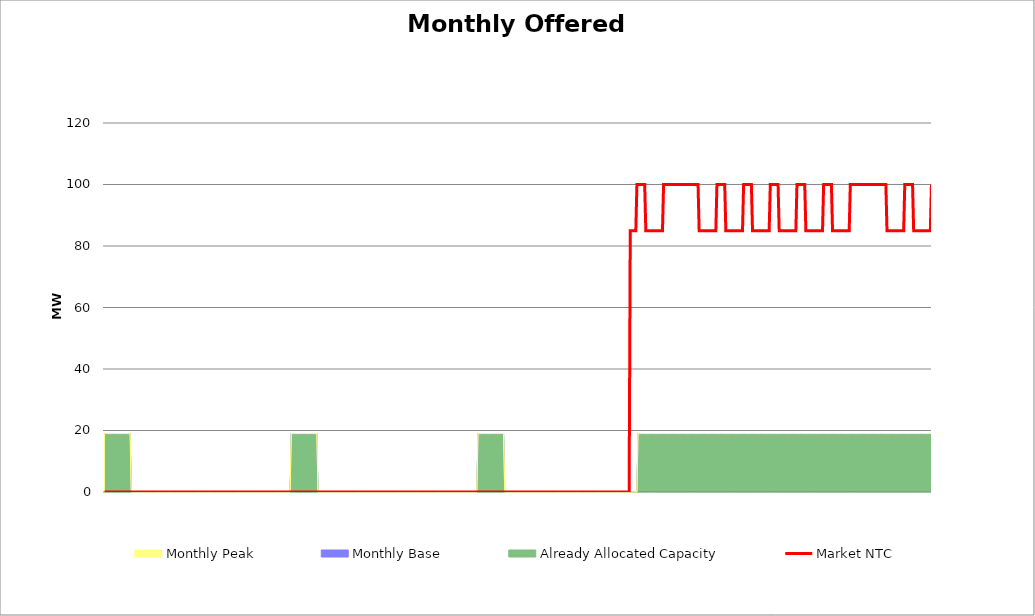
| Category | Market NTC |
|---|---|
| 0 | 0 |
| 1 | 0 |
| 2 | 0 |
| 3 | 0 |
| 4 | 0 |
| 5 | 0 |
| 6 | 0 |
| 7 | 0 |
| 8 | 0 |
| 9 | 0 |
| 10 | 0 |
| 11 | 0 |
| 12 | 0 |
| 13 | 0 |
| 14 | 0 |
| 15 | 0 |
| 16 | 0 |
| 17 | 0 |
| 18 | 0 |
| 19 | 0 |
| 20 | 0 |
| 21 | 0 |
| 22 | 0 |
| 23 | 0 |
| 24 | 0 |
| 25 | 0 |
| 26 | 0 |
| 27 | 0 |
| 28 | 0 |
| 29 | 0 |
| 30 | 0 |
| 31 | 0 |
| 32 | 0 |
| 33 | 0 |
| 34 | 0 |
| 35 | 0 |
| 36 | 0 |
| 37 | 0 |
| 38 | 0 |
| 39 | 0 |
| 40 | 0 |
| 41 | 0 |
| 42 | 0 |
| 43 | 0 |
| 44 | 0 |
| 45 | 0 |
| 46 | 0 |
| 47 | 0 |
| 48 | 0 |
| 49 | 0 |
| 50 | 0 |
| 51 | 0 |
| 52 | 0 |
| 53 | 0 |
| 54 | 0 |
| 55 | 0 |
| 56 | 0 |
| 57 | 0 |
| 58 | 0 |
| 59 | 0 |
| 60 | 0 |
| 61 | 0 |
| 62 | 0 |
| 63 | 0 |
| 64 | 0 |
| 65 | 0 |
| 66 | 0 |
| 67 | 0 |
| 68 | 0 |
| 69 | 0 |
| 70 | 0 |
| 71 | 0 |
| 72 | 0 |
| 73 | 0 |
| 74 | 0 |
| 75 | 0 |
| 76 | 0 |
| 77 | 0 |
| 78 | 0 |
| 79 | 0 |
| 80 | 0 |
| 81 | 0 |
| 82 | 0 |
| 83 | 0 |
| 84 | 0 |
| 85 | 0 |
| 86 | 0 |
| 87 | 0 |
| 88 | 0 |
| 89 | 0 |
| 90 | 0 |
| 91 | 0 |
| 92 | 0 |
| 93 | 0 |
| 94 | 0 |
| 95 | 0 |
| 96 | 0 |
| 97 | 0 |
| 98 | 0 |
| 99 | 0 |
| 100 | 0 |
| 101 | 0 |
| 102 | 0 |
| 103 | 0 |
| 104 | 0 |
| 105 | 0 |
| 106 | 0 |
| 107 | 0 |
| 108 | 0 |
| 109 | 0 |
| 110 | 0 |
| 111 | 0 |
| 112 | 0 |
| 113 | 0 |
| 114 | 0 |
| 115 | 0 |
| 116 | 0 |
| 117 | 0 |
| 118 | 0 |
| 119 | 0 |
| 120 | 0 |
| 121 | 0 |
| 122 | 0 |
| 123 | 0 |
| 124 | 0 |
| 125 | 0 |
| 126 | 0 |
| 127 | 0 |
| 128 | 0 |
| 129 | 0 |
| 130 | 0 |
| 131 | 0 |
| 132 | 0 |
| 133 | 0 |
| 134 | 0 |
| 135 | 0 |
| 136 | 0 |
| 137 | 0 |
| 138 | 0 |
| 139 | 0 |
| 140 | 0 |
| 141 | 0 |
| 142 | 0 |
| 143 | 0 |
| 144 | 0 |
| 145 | 0 |
| 146 | 0 |
| 147 | 0 |
| 148 | 0 |
| 149 | 0 |
| 150 | 0 |
| 151 | 0 |
| 152 | 0 |
| 153 | 0 |
| 154 | 0 |
| 155 | 0 |
| 156 | 0 |
| 157 | 0 |
| 158 | 0 |
| 159 | 0 |
| 160 | 0 |
| 161 | 0 |
| 162 | 0 |
| 163 | 0 |
| 164 | 0 |
| 165 | 0 |
| 166 | 0 |
| 167 | 0 |
| 168 | 0 |
| 169 | 0 |
| 170 | 0 |
| 171 | 0 |
| 172 | 0 |
| 173 | 0 |
| 174 | 0 |
| 175 | 0 |
| 176 | 0 |
| 177 | 0 |
| 178 | 0 |
| 179 | 0 |
| 180 | 0 |
| 181 | 0 |
| 182 | 0 |
| 183 | 0 |
| 184 | 0 |
| 185 | 0 |
| 186 | 0 |
| 187 | 0 |
| 188 | 0 |
| 189 | 0 |
| 190 | 0 |
| 191 | 0 |
| 192 | 0 |
| 193 | 0 |
| 194 | 0 |
| 195 | 0 |
| 196 | 0 |
| 197 | 0 |
| 198 | 0 |
| 199 | 0 |
| 200 | 0 |
| 201 | 0 |
| 202 | 0 |
| 203 | 0 |
| 204 | 0 |
| 205 | 0 |
| 206 | 0 |
| 207 | 0 |
| 208 | 0 |
| 209 | 0 |
| 210 | 0 |
| 211 | 0 |
| 212 | 0 |
| 213 | 0 |
| 214 | 0 |
| 215 | 0 |
| 216 | 0 |
| 217 | 0 |
| 218 | 0 |
| 219 | 0 |
| 220 | 0 |
| 221 | 0 |
| 222 | 0 |
| 223 | 0 |
| 224 | 0 |
| 225 | 0 |
| 226 | 0 |
| 227 | 0 |
| 228 | 0 |
| 229 | 0 |
| 230 | 0 |
| 231 | 0 |
| 232 | 0 |
| 233 | 0 |
| 234 | 0 |
| 235 | 0 |
| 236 | 0 |
| 237 | 0 |
| 238 | 0 |
| 239 | 0 |
| 240 | 0 |
| 241 | 0 |
| 242 | 0 |
| 243 | 0 |
| 244 | 0 |
| 245 | 0 |
| 246 | 0 |
| 247 | 0 |
| 248 | 0 |
| 249 | 0 |
| 250 | 0 |
| 251 | 0 |
| 252 | 0 |
| 253 | 0 |
| 254 | 0 |
| 255 | 0 |
| 256 | 0 |
| 257 | 0 |
| 258 | 0 |
| 259 | 0 |
| 260 | 0 |
| 261 | 0 |
| 262 | 0 |
| 263 | 0 |
| 264 | 0 |
| 265 | 0 |
| 266 | 0 |
| 267 | 0 |
| 268 | 0 |
| 269 | 0 |
| 270 | 0 |
| 271 | 0 |
| 272 | 0 |
| 273 | 0 |
| 274 | 0 |
| 275 | 0 |
| 276 | 0 |
| 277 | 0 |
| 278 | 0 |
| 279 | 0 |
| 280 | 0 |
| 281 | 0 |
| 282 | 0 |
| 283 | 0 |
| 284 | 0 |
| 285 | 0 |
| 286 | 0 |
| 287 | 0 |
| 288 | 0 |
| 289 | 0 |
| 290 | 0 |
| 291 | 0 |
| 292 | 0 |
| 293 | 0 |
| 294 | 0 |
| 295 | 0 |
| 296 | 0 |
| 297 | 0 |
| 298 | 0 |
| 299 | 0 |
| 300 | 0 |
| 301 | 0 |
| 302 | 0 |
| 303 | 0 |
| 304 | 0 |
| 305 | 0 |
| 306 | 0 |
| 307 | 0 |
| 308 | 0 |
| 309 | 0 |
| 310 | 0 |
| 311 | 0 |
| 312 | 0 |
| 313 | 0 |
| 314 | 0 |
| 315 | 0 |
| 316 | 0 |
| 317 | 0 |
| 318 | 0 |
| 319 | 0 |
| 320 | 0 |
| 321 | 0 |
| 322 | 0 |
| 323 | 0 |
| 324 | 0 |
| 325 | 0 |
| 326 | 0 |
| 327 | 0 |
| 328 | 0 |
| 329 | 0 |
| 330 | 0 |
| 331 | 0 |
| 332 | 0 |
| 333 | 0 |
| 334 | 0 |
| 335 | 0 |
| 336 | 0 |
| 337 | 0 |
| 338 | 0 |
| 339 | 0 |
| 340 | 0 |
| 341 | 0 |
| 342 | 0 |
| 343 | 0 |
| 344 | 0 |
| 345 | 0 |
| 346 | 0 |
| 347 | 0 |
| 348 | 0 |
| 349 | 0 |
| 350 | 0 |
| 351 | 0 |
| 352 | 0 |
| 353 | 0 |
| 354 | 0 |
| 355 | 0 |
| 356 | 0 |
| 357 | 0 |
| 358 | 0 |
| 359 | 0 |
| 360 | 0 |
| 361 | 0 |
| 362 | 0 |
| 363 | 0 |
| 364 | 0 |
| 365 | 0 |
| 366 | 0 |
| 367 | 0 |
| 368 | 0 |
| 369 | 0 |
| 370 | 0 |
| 371 | 0 |
| 372 | 0 |
| 373 | 0 |
| 374 | 0 |
| 375 | 0 |
| 376 | 0 |
| 377 | 0 |
| 378 | 0 |
| 379 | 0 |
| 380 | 0 |
| 381 | 0 |
| 382 | 0 |
| 383 | 0 |
| 384 | 0 |
| 385 | 0 |
| 386 | 0 |
| 387 | 0 |
| 388 | 0 |
| 389 | 0 |
| 390 | 0 |
| 391 | 0 |
| 392 | 0 |
| 393 | 0 |
| 394 | 0 |
| 395 | 0 |
| 396 | 0 |
| 397 | 0 |
| 398 | 0 |
| 399 | 0 |
| 400 | 0 |
| 401 | 0 |
| 402 | 0 |
| 403 | 0 |
| 404 | 0 |
| 405 | 0 |
| 406 | 0 |
| 407 | 0 |
| 408 | 0 |
| 409 | 0 |
| 410 | 0 |
| 411 | 0 |
| 412 | 0 |
| 413 | 0 |
| 414 | 0 |
| 415 | 0 |
| 416 | 0 |
| 417 | 0 |
| 418 | 0 |
| 419 | 0 |
| 420 | 0 |
| 421 | 0 |
| 422 | 0 |
| 423 | 0 |
| 424 | 0 |
| 425 | 0 |
| 426 | 0 |
| 427 | 0 |
| 428 | 0 |
| 429 | 0 |
| 430 | 0 |
| 431 | 0 |
| 432 | 0 |
| 433 | 0 |
| 434 | 0 |
| 435 | 0 |
| 436 | 0 |
| 437 | 0 |
| 438 | 0 |
| 439 | 0 |
| 440 | 0 |
| 441 | 0 |
| 442 | 0 |
| 443 | 0 |
| 444 | 0 |
| 445 | 0 |
| 446 | 0 |
| 447 | 0 |
| 448 | 0 |
| 449 | 0 |
| 450 | 0 |
| 451 | 0 |
| 452 | 0 |
| 453 | 0 |
| 454 | 0 |
| 455 | 0 |
| 456 | 0 |
| 457 | 0 |
| 458 | 0 |
| 459 | 0 |
| 460 | 0 |
| 461 | 0 |
| 462 | 0 |
| 463 | 0 |
| 464 | 0 |
| 465 | 0 |
| 466 | 0 |
| 467 | 0 |
| 468 | 0 |
| 469 | 0 |
| 470 | 0 |
| 471 | 0 |
| 472 | 0 |
| 473 | 85 |
| 474 | 85 |
| 475 | 85 |
| 476 | 85 |
| 477 | 85 |
| 478 | 85 |
| 479 | 100 |
| 480 | 100 |
| 481 | 100 |
| 482 | 100 |
| 483 | 100 |
| 484 | 100 |
| 485 | 100 |
| 486 | 100 |
| 487 | 85 |
| 488 | 85 |
| 489 | 85 |
| 490 | 85 |
| 491 | 85 |
| 492 | 85 |
| 493 | 85 |
| 494 | 85 |
| 495 | 85 |
| 496 | 85 |
| 497 | 85 |
| 498 | 85 |
| 499 | 85 |
| 500 | 85 |
| 501 | 85 |
| 502 | 85 |
| 503 | 100 |
| 504 | 100 |
| 505 | 100 |
| 506 | 100 |
| 507 | 100 |
| 508 | 100 |
| 509 | 100 |
| 510 | 100 |
| 511 | 100 |
| 512 | 100 |
| 513 | 100 |
| 514 | 100 |
| 515 | 100 |
| 516 | 100 |
| 517 | 100 |
| 518 | 100 |
| 519 | 100 |
| 520 | 100 |
| 521 | 100 |
| 522 | 100 |
| 523 | 100 |
| 524 | 100 |
| 525 | 100 |
| 526 | 100 |
| 527 | 100 |
| 528 | 100 |
| 529 | 100 |
| 530 | 100 |
| 531 | 100 |
| 532 | 100 |
| 533 | 100 |
| 534 | 100 |
| 535 | 85 |
| 536 | 85 |
| 537 | 85 |
| 538 | 85 |
| 539 | 85 |
| 540 | 85 |
| 541 | 85 |
| 542 | 85 |
| 543 | 85 |
| 544 | 85 |
| 545 | 85 |
| 546 | 85 |
| 547 | 85 |
| 548 | 85 |
| 549 | 85 |
| 550 | 85 |
| 551 | 100 |
| 552 | 100 |
| 553 | 100 |
| 554 | 100 |
| 555 | 100 |
| 556 | 100 |
| 557 | 100 |
| 558 | 100 |
| 559 | 85 |
| 560 | 85 |
| 561 | 85 |
| 562 | 85 |
| 563 | 85 |
| 564 | 85 |
| 565 | 85 |
| 566 | 85 |
| 567 | 85 |
| 568 | 85 |
| 569 | 85 |
| 570 | 85 |
| 571 | 85 |
| 572 | 85 |
| 573 | 85 |
| 574 | 85 |
| 575 | 100 |
| 576 | 100 |
| 577 | 100 |
| 578 | 100 |
| 579 | 100 |
| 580 | 100 |
| 581 | 100 |
| 582 | 100 |
| 583 | 85 |
| 584 | 85 |
| 585 | 85 |
| 586 | 85 |
| 587 | 85 |
| 588 | 85 |
| 589 | 85 |
| 590 | 85 |
| 591 | 85 |
| 592 | 85 |
| 593 | 85 |
| 594 | 85 |
| 595 | 85 |
| 596 | 85 |
| 597 | 85 |
| 598 | 85 |
| 599 | 100 |
| 600 | 100 |
| 601 | 100 |
| 602 | 100 |
| 603 | 100 |
| 604 | 100 |
| 605 | 100 |
| 606 | 100 |
| 607 | 85 |
| 608 | 85 |
| 609 | 85 |
| 610 | 85 |
| 611 | 85 |
| 612 | 85 |
| 613 | 85 |
| 614 | 85 |
| 615 | 85 |
| 616 | 85 |
| 617 | 85 |
| 618 | 85 |
| 619 | 85 |
| 620 | 85 |
| 621 | 85 |
| 622 | 85 |
| 623 | 100 |
| 624 | 100 |
| 625 | 100 |
| 626 | 100 |
| 627 | 100 |
| 628 | 100 |
| 629 | 100 |
| 630 | 100 |
| 631 | 85 |
| 632 | 85 |
| 633 | 85 |
| 634 | 85 |
| 635 | 85 |
| 636 | 85 |
| 637 | 85 |
| 638 | 85 |
| 639 | 85 |
| 640 | 85 |
| 641 | 85 |
| 642 | 85 |
| 643 | 85 |
| 644 | 85 |
| 645 | 85 |
| 646 | 85 |
| 647 | 100 |
| 648 | 100 |
| 649 | 100 |
| 650 | 100 |
| 651 | 100 |
| 652 | 100 |
| 653 | 100 |
| 654 | 100 |
| 655 | 85 |
| 656 | 85 |
| 657 | 85 |
| 658 | 85 |
| 659 | 85 |
| 660 | 85 |
| 661 | 85 |
| 662 | 85 |
| 663 | 85 |
| 664 | 85 |
| 665 | 85 |
| 666 | 85 |
| 667 | 85 |
| 668 | 85 |
| 669 | 85 |
| 670 | 85 |
| 671 | 100 |
| 672 | 100 |
| 673 | 100 |
| 674 | 100 |
| 675 | 100 |
| 676 | 100 |
| 677 | 100 |
| 678 | 100 |
| 679 | 100 |
| 680 | 100 |
| 681 | 100 |
| 682 | 100 |
| 683 | 100 |
| 684 | 100 |
| 685 | 100 |
| 686 | 100 |
| 687 | 100 |
| 688 | 100 |
| 689 | 100 |
| 690 | 100 |
| 691 | 100 |
| 692 | 100 |
| 693 | 100 |
| 694 | 100 |
| 695 | 100 |
| 696 | 100 |
| 697 | 100 |
| 698 | 100 |
| 699 | 100 |
| 700 | 100 |
| 701 | 100 |
| 702 | 100 |
| 703 | 100 |
| 704 | 85 |
| 705 | 85 |
| 706 | 85 |
| 707 | 85 |
| 708 | 85 |
| 709 | 85 |
| 710 | 85 |
| 711 | 85 |
| 712 | 85 |
| 713 | 85 |
| 714 | 85 |
| 715 | 85 |
| 716 | 85 |
| 717 | 85 |
| 718 | 85 |
| 719 | 85 |
| 720 | 100 |
| 721 | 100 |
| 722 | 100 |
| 723 | 100 |
| 724 | 100 |
| 725 | 100 |
| 726 | 100 |
| 727 | 100 |
| 728 | 85 |
| 729 | 85 |
| 730 | 85 |
| 731 | 85 |
| 732 | 85 |
| 733 | 85 |
| 734 | 85 |
| 735 | 85 |
| 736 | 85 |
| 737 | 85 |
| 738 | 85 |
| 739 | 85 |
| 740 | 85 |
| 741 | 85 |
| 742 | 85 |
| 743 | 85 |
| 744 | 100 |